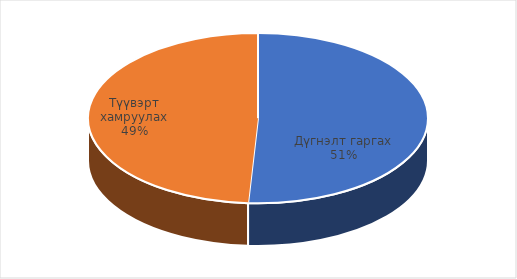
| Category | Total |
|---|---|
| Дүгнэлт гаргах | 137 |
| Түүвэрт хамруулах | 132 |